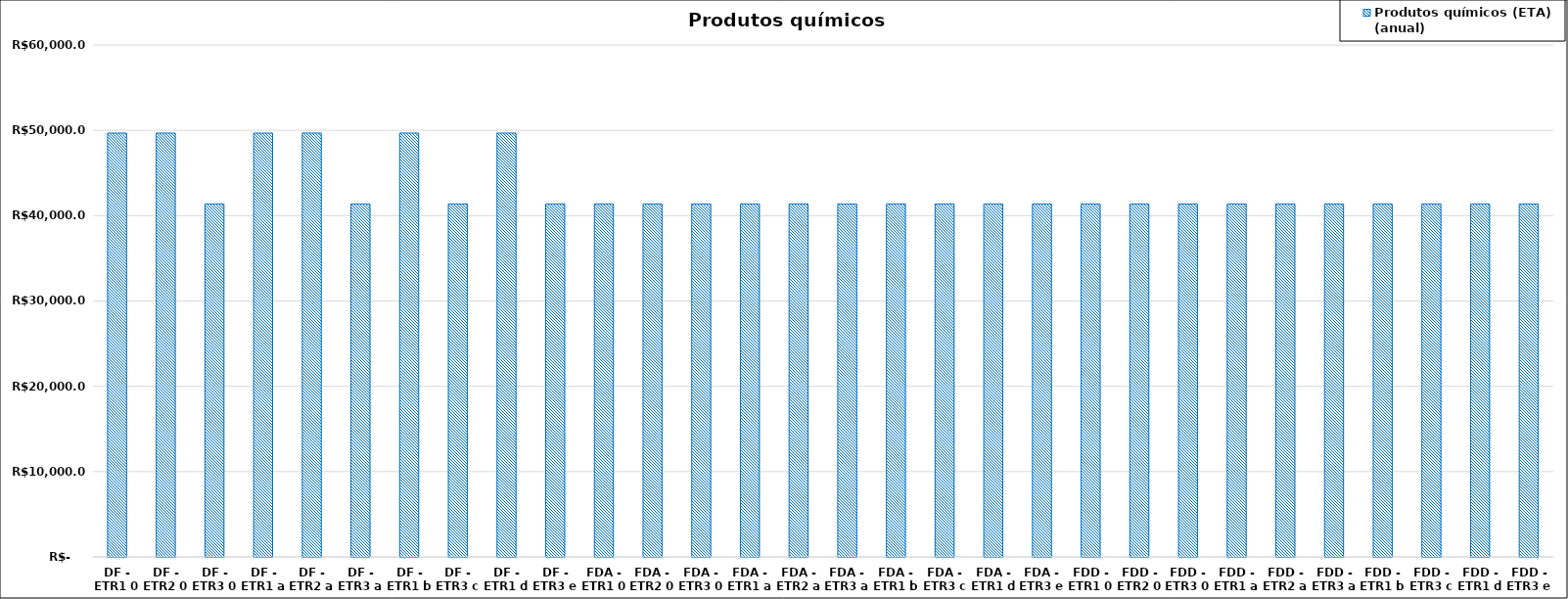
| Category | Produtos químicos (ETA) (anual) |
|---|---|
| DF - ETR1 0 | 49680 |
| DF - ETR2 0 | 49680 |
| DF - ETR3 0 | 41371.2 |
| DF - ETR1 a | 49680 |
| DF - ETR2 a | 49680 |
| DF - ETR3 a | 41371.2 |
| DF - ETR1 b | 49680 |
| DF - ETR3 c | 41371.2 |
| DF - ETR1 d | 49680 |
| DF - ETR3 e | 41371.2 |
| FDA - ETR1 0 | 41371.2 |
| FDA - ETR2 0 | 41371.2 |
| FDA - ETR3 0 | 41371.2 |
| FDA - ETR1 a | 41371.2 |
| FDA - ETR2 a | 41371.2 |
| FDA - ETR3 a | 41371.2 |
| FDA - ETR1 b | 41371.2 |
| FDA - ETR3 c | 41371.2 |
| FDA - ETR1 d | 41371.2 |
| FDA - ETR3 e | 41371.2 |
| FDD - ETR1 0 | 41371.2 |
| FDD - ETR2 0 | 41371.2 |
| FDD - ETR3 0 | 41371.2 |
| FDD - ETR1 a | 41371.2 |
| FDD - ETR2 a | 41371.2 |
| FDD - ETR3 a | 41371.2 |
| FDD - ETR1 b | 41371.2 |
| FDD - ETR3 c | 41371.2 |
| FDD - ETR1 d | 41371.2 |
| FDD - ETR3 e | 41371.2 |